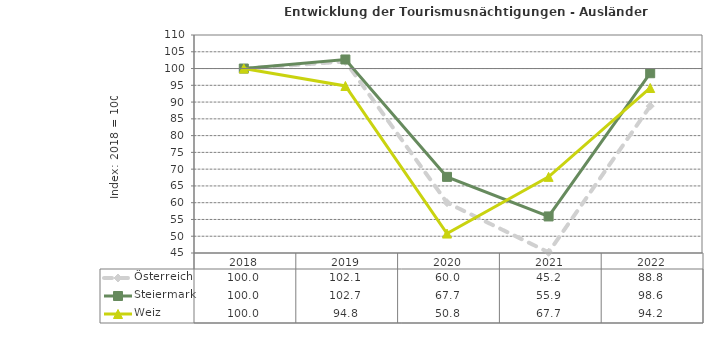
| Category | Österreich | Steiermark | Weiz |
|---|---|---|---|
| 2022.0 | 88.8 | 98.6 | 94.2 |
| 2021.0 | 45.2 | 55.9 | 67.7 |
| 2020.0 | 60 | 67.7 | 50.8 |
| 2019.0 | 102.1 | 102.7 | 94.8 |
| 2018.0 | 100 | 100 | 100 |